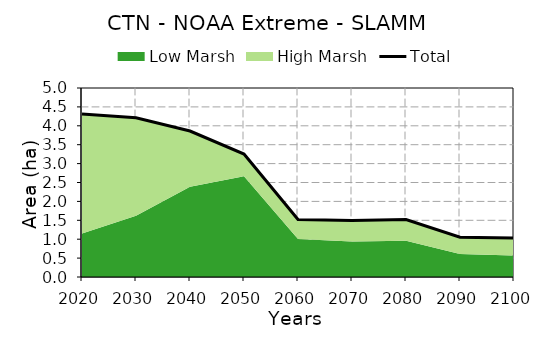
| Category | Total |
|---|---|
| 0 | 4.314 |
| 1 | 4.213 |
| 2 | 3.861 |
| 3 | 3.252 |
| 4 | 1.52 |
| 5 | 1.496 |
| 6 | 1.518 |
| 7 | 1.054 |
| 8 | 1.03 |